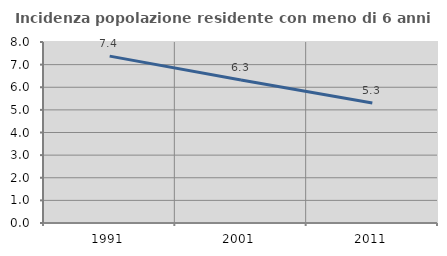
| Category | Incidenza popolazione residente con meno di 6 anni |
|---|---|
| 1991.0 | 7.375 |
| 2001.0 | 6.322 |
| 2011.0 | 5.301 |